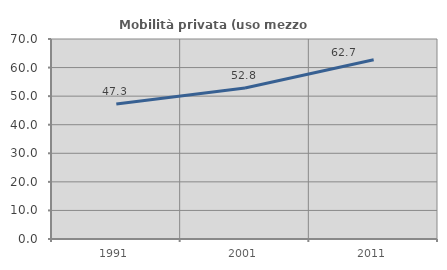
| Category | Mobilità privata (uso mezzo privato) |
|---|---|
| 1991.0 | 47.258 |
| 2001.0 | 52.833 |
| 2011.0 | 62.717 |